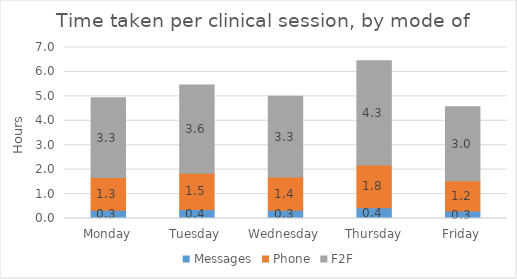
| Category | Messages | Phone | F2F |
|---|---|---|---|
| Monday | 0.333 | 1.341 | 3.271 |
| Tuesday | 0.368 | 1.482 | 3.616 |
| Wednesday | 0.337 | 1.357 | 3.311 |
| Thursday | 0.435 | 1.751 | 4.272 |
| Friday | 0.308 | 1.239 | 3.024 |